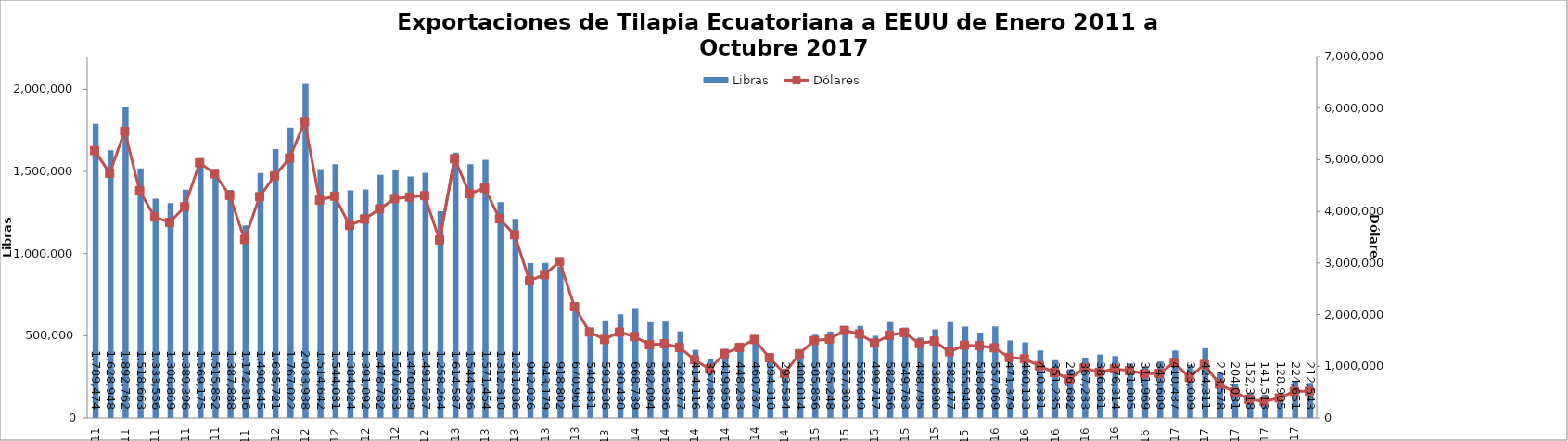
| Category | Libras  |
|---|---|
| 2011-01-01 | 1789473.82 |
| 2011-02-01 | 1628948.076 |
| 2011-03-01 | 1892761.535 |
| 2011-04-01 | 1518662.961 |
| 2011-05-01 | 1333555.926 |
| 2011-06-01 | 1306869.243 |
| 2011-07-01 | 1389396.24 |
| 2011-08-01 | 1569174.756 |
| 2011-09-01 | 1515852.096 |
| 2011-10-01 | 1387888.293 |
| 2011-11-01 | 1172315.891 |
| 2011-12-01 | 1490644.699 |
| 2012-01-01 | 1635720.607 |
| 2012-02-01 | 1767022.174 |
| 2012-03-01 | 2033937.505 |
| 2012-04-01 | 1514641.77 |
| 2012-05-01 | 1544031.293 |
| 2012-06-01 | 1384823.899 |
| 2012-07-01 | 1391091.577 |
| 2012-08-01 | 1478781.747 |
| 2012-09-01 | 1507653.188 |
| 2012-10-01 | 1470049.326 |
| 2012-11-01 | 1491526.539 |
| 2012-12-01 | 1258264 |
| 2013-01-01 | 1614587 |
| 2013-02-01 | 1544536.146 |
| 2013-03-01 | 1571454.312 |
| 2013-04-01 | 1312310.196 |
| 2013-05-01 | 1211835.551 |
| 2013-06-01 | 942025.58 |
| 2013-07-01 | 943178.586 |
| 2013-08-01 | 918802.324 |
| 2013-09-01 | 670961.192 |
| 2013-10-01 | 540431.235 |
| 2013-11-01 | 593535.64 |
| 2013-12-01 | 630429.621 |
| 2014-01-01 | 668739 |
| 2014-02-01 | 582093.766 |
| 2014-03-01 | 585936.383 |
| 2014-04-01 | 526976.561 |
| 2014-05-01 | 414116.473 |
| 2014-06-01 | 357861.695 |
| 2014-07-01 | 419958.663 |
| 2014-08-01 | 448233 |
| 2014-09-01 | 460737.149 |
| 2014-10-01 | 394310.347 |
| 2014-11-01 | 293533.672 |
| 2014-12-01 | 400013.647 |
| 2015-01-01 | 505856.493 |
| 2015-02-01 | 525248 |
| 2015-03-01 | 557303.039 |
| 2015-04-01 | 559648.733 |
| 2015-05-01 | 499716.682 |
| 2015-06-01 | 582955.764 |
| 2015-07-01 | 549763.307 |
| 2015-08-01 | 488795.094 |
| 2015-09-01 | 538890.219 |
| 2015-10-01 | 582477.366 |
| 2015-11-01 | 555949.414 |
| 2015-12-01 | 518850.405 |
| 2016-01-01 | 557069.351 |
| 2016-02-01 | 471378.754 |
| 2016-03-01 | 460133.089 |
| 2016-04-01 | 410331.175 |
| 2016-05-01 | 351235 |
| 2016-06-01 | 296682 |
| 2016-07-01 | 367233.45 |
| 2016-08-01 | 386080.575 |
| 2016-09-01 | 376314.197 |
| 2016-10-01 | 331005.258 |
| 2016-11-01 | 311968.537 |
| 2016-12-01 | 343608.956 |
| 2017-01-01 | 410436.996 |
| 2017-02-01 | 323009.174 |
| 2017-03-01 | 424310.544 |
| 2017-04-01 | 273577.632 |
| 2017-05-01 | 204031.321 |
| 2017-06-01 | 152318.019 |
| 2017-07-01 | 141513.274 |
| 2017-08-01 | 128905.167 |
| 2017-09-01 | 224650.945 |
| 2017-10-01 | 212543.281 |